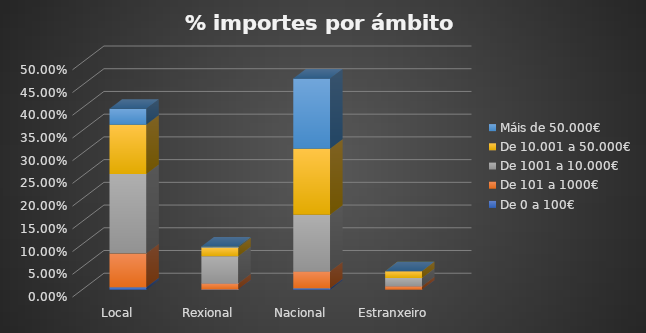
| Category | De 0 a 100€ | De 101 a 1000€ | De 1001 a 10.000€ | De 10.001 a 50.000€ | Máis de 50.000€ |
|---|---|---|---|---|---|
| Local | 0.006 | 0.074 | 0.175 | 0.109 | 0.035 |
| Rexional | 0.001 | 0.013 | 0.06 | 0.019 | 0.002 |
| Nacional | 0.003 | 0.037 | 0.125 | 0.145 | 0.155 |
| Estranxeiro | 0 | 0.007 | 0.018 | 0.015 | 0 |